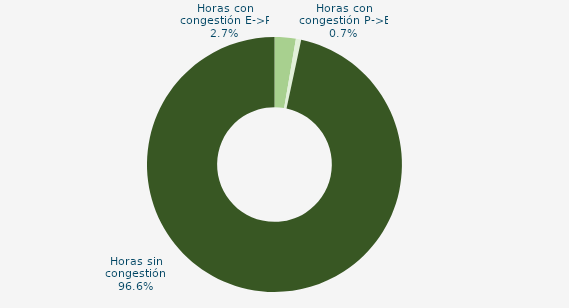
| Category | Horas con congestión E->P |
|---|---|
| Horas con congestión E->P | 2.688 |
| Horas con congestión P->E | 0.672 |
| Horas sin congestión | 96.64 |